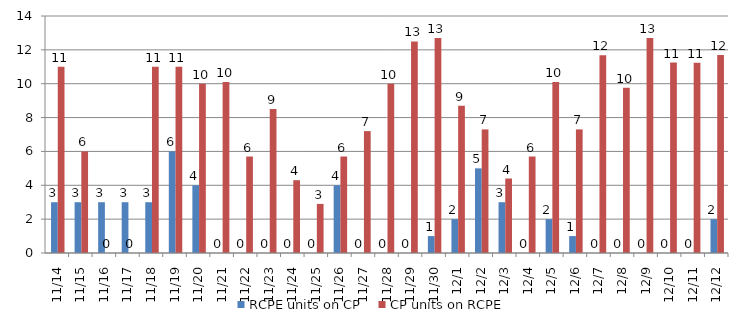
| Category | RCPE units on CP | CP units on RCPE |
|---|---|---|
| 2015-11-14 | 3 | 11 |
| 2015-11-15 | 3 | 6 |
| 2015-11-16 | 3 | 0 |
| 2015-11-17 | 3 | 0 |
| 2015-11-18 | 3 | 11 |
| 2015-11-19 | 6 | 11 |
| 2015-11-20 | 4 | 10 |
| 2015-11-21 | 0 | 10.1 |
| 2015-11-22 | 0 | 5.7 |
| 2015-11-23 | 0 | 8.5 |
| 2015-11-24 | 0 | 4.3 |
| 2015-11-25 | 0 | 2.9 |
| 2015-11-26 | 4 | 5.7 |
| 2015-11-27 | 0 | 7.2 |
| 2015-11-28 | 0 | 10 |
| 2015-11-29 | 0 | 12.5 |
| 2015-11-30 | 1 | 12.7 |
| 2015-12-01 | 2 | 8.7 |
| 2015-12-02 | 5 | 7.3 |
| 2015-12-03 | 3 | 4.4 |
| 2015-12-04 | 0 | 5.7 |
| 2015-12-05 | 2 | 10.1 |
| 2015-12-06 | 1 | 7.3 |
| 2015-12-07 | 0 | 11.68 |
| 2015-12-08 | 0 | 9.76 |
| 2015-12-09 | 0 | 12.697 |
| 2015-12-10 | 0 | 11.25 |
| 2015-12-11 | 0 | 11.237 |
| 2015-12-12 | 2 | 11.703 |